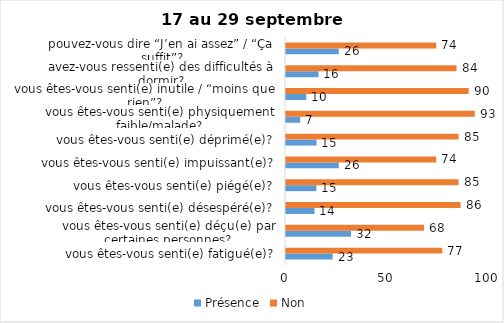
| Category | Présence | Non |
|---|---|---|
| vous êtes-vous senti(e) fatigué(e)? | 23 | 77 |
| vous êtes-vous senti(e) déçu(e) par certaines personnes? | 32 | 68 |
| vous êtes-vous senti(e) désespéré(e)? | 14 | 86 |
| vous êtes-vous senti(e) piégé(e)? | 15 | 85 |
| vous êtes-vous senti(e) impuissant(e)? | 26 | 74 |
| vous êtes-vous senti(e) déprimé(e)? | 15 | 85 |
| vous êtes-vous senti(e) physiquement faible/malade? | 7 | 93 |
| vous êtes-vous senti(e) inutile / “moins que rien”? | 10 | 90 |
| avez-vous ressenti(e) des difficultés à dormir? | 16 | 84 |
| pouvez-vous dire “J’en ai assez” / “Ça suffit”? | 26 | 74 |